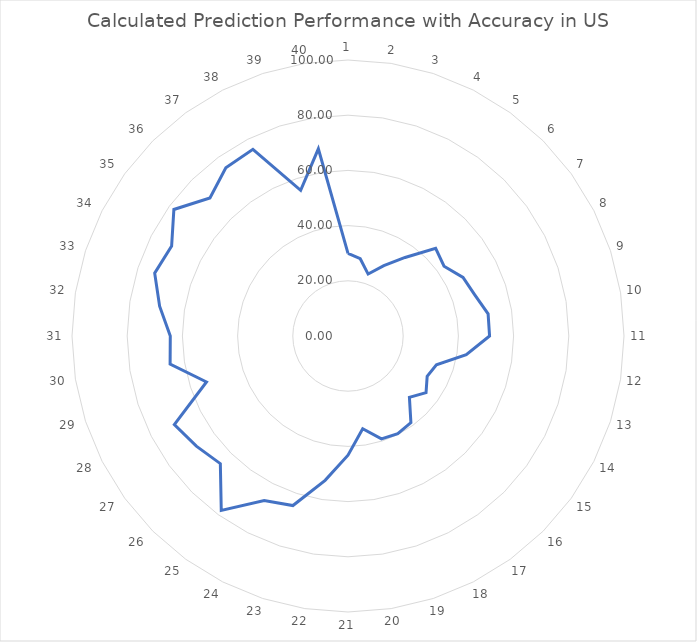
| Category | Series 0 |
|---|---|
| 0 | 29.941 |
| 1 | 28.356 |
| 2 | 23.597 |
| 3 | 28.6 |
| 4 | 35.182 |
| 5 | 44.913 |
| 6 | 43.011 |
| 7 | 46.774 |
| 8 | 48.294 |
| 9 | 51.395 |
| 10 | 51.294 |
| 11 | 43.388 |
| 12 | 33.685 |
| 13 | 32.192 |
| 14 | 34.952 |
| 15 | 31.467 |
| 16 | 38.773 |
| 17 | 39.737 |
| 18 | 39.205 |
| 19 | 34.033 |
| 20 | 43.186 |
| 21 | 52.964 |
| 22 | 64.589 |
| 23 | 66.878 |
| 24 | 78.126 |
| 25 | 65.411 |
| 26 | 67.911 |
| 27 | 70.618 |
| 28 | 53.915 |
| 29 | 65.256 |
| 30 | 64.39 |
| 31 | 69.105 |
| 32 | 73.645 |
| 33 | 71.719 |
| 34 | 77.982 |
| 35 | 70.738 |
| 36 | 75.31 |
| 37 | 75.893 |
| 38 | 55.506 |
| 39 | 68.671 |